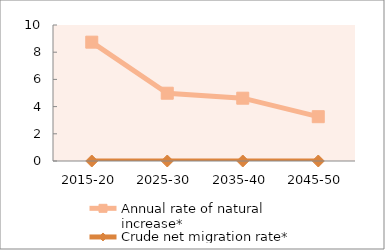
| Category | Annual rate of natural increase* | Crude net migration rate* |
|---|---|---|
| 2015-20 | 8.738 | 0 |
| 2025-30 | 4.984 | 0 |
| 2035-40 | 4.618 | 0 |
| 2045-50 | 3.258 | 0 |